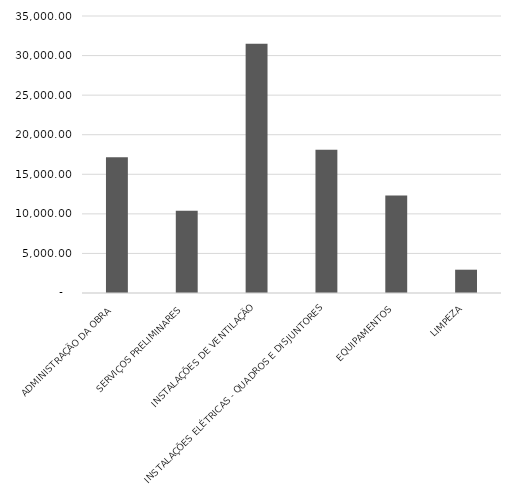
| Category | Series 0 |
|---|---|
| ADMINISTRAÇÃO DA OBRA | 17145.54 |
| SERVIÇOS PRELIMINARES | 10400.45 |
| INSTALAÇÕES DE VENTILAÇÃO | 31490.58 |
| INSTALAÇÕES ELÉTRICAS - QUADROS E DISJUNTORES | 18086.5 |
| EQUIPAMENTOS | 12304.2 |
| LIMPEZA | 2943.77 |